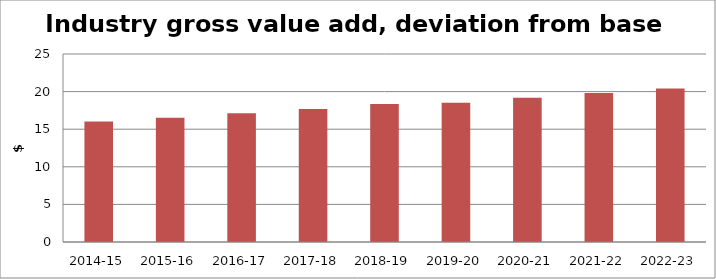
| Category | Series 0 |
|---|---|
| 2014-15 | 16.018 |
| 2015-16 | 16.532 |
| 2016-17 | 17.11 |
| 2017-18 | 17.683 |
| 2018-19 | 18.34 |
| 2019-20 | 18.505 |
| 2020-21 | 19.178 |
| 2021-22 | 19.808 |
| 2022-23 | 20.412 |